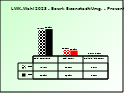
| Category | 2018 | 2023 |
|---|---|---|
| Bgld. Bauernbund | 0.787 | 0.816 |
| SPÖ Bauern | 0.182 | 0.163 |
| Freiheitliche Bauern | 0.031 | 0.021 |